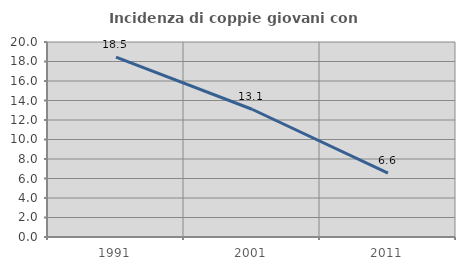
| Category | Incidenza di coppie giovani con figli |
|---|---|
| 1991.0 | 18.457 |
| 2001.0 | 13.103 |
| 2011.0 | 6.557 |